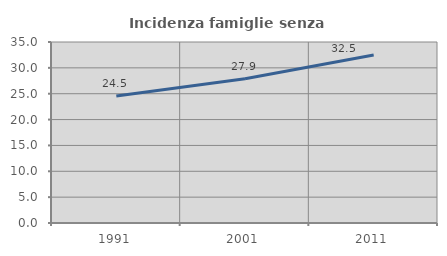
| Category | Incidenza famiglie senza nuclei |
|---|---|
| 1991.0 | 24.55 |
| 2001.0 | 27.888 |
| 2011.0 | 32.472 |